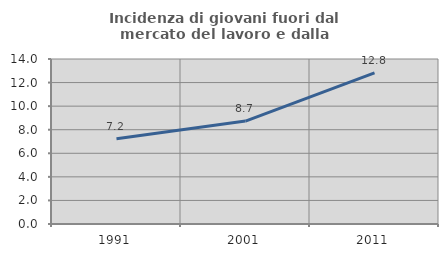
| Category | Incidenza di giovani fuori dal mercato del lavoro e dalla formazione  |
|---|---|
| 1991.0 | 7.24 |
| 2001.0 | 8.734 |
| 2011.0 | 12.819 |